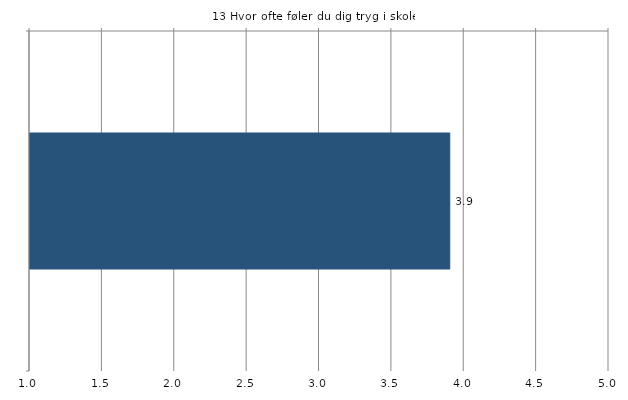
| Category | Gns. |
|---|---|
|    | 3.9 |